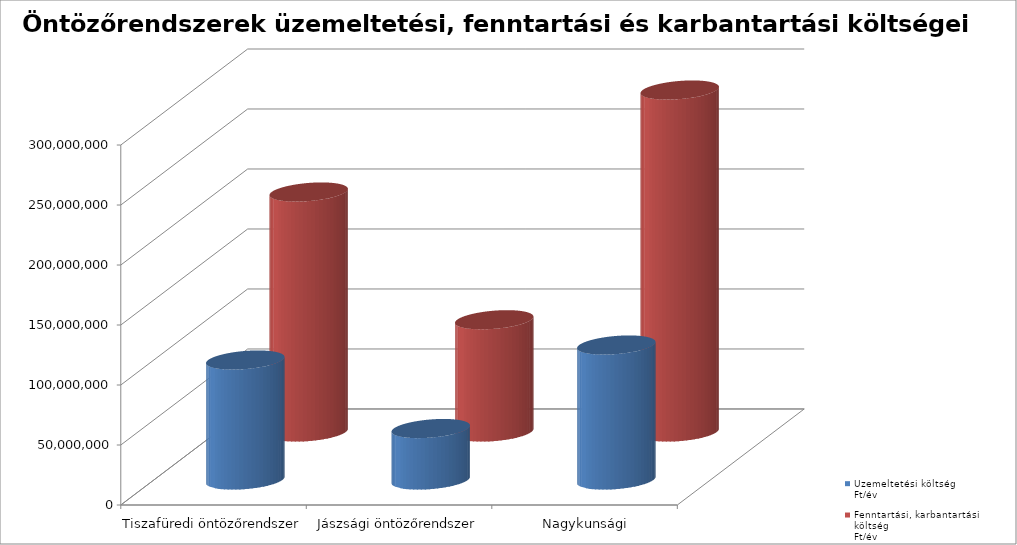
| Category | Üzemeltetési költség
Ft/év | Fenntartási, karbantartási költség
Ft/év |
|---|---|---|
| Tiszafüredi öntözőrendszer | 100000000 | 200000000 |
| Jászsági öntözőrendszer | 42900000 | 93550000 |
| Nagykunsági öntözőrendszer | 112500000 | 284999800 |